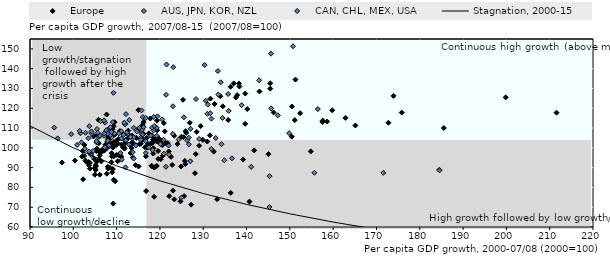
| Category | bottom | lower left | lower right | upper left | upper right |
|---|---|---|---|---|---|
| 89.0 | 59 | 45.071 | 0 | 51.929 | 0 |
| 115.93946047039123 | 59 | 45.071 | 0 | 51.929 | 0 |
| 115.93946047039123 | 59 | 0 | 45.071 | 0 | 51.929 |
| 221.0 | 59 | 0 | 45.071 | 0 | 51.929 |